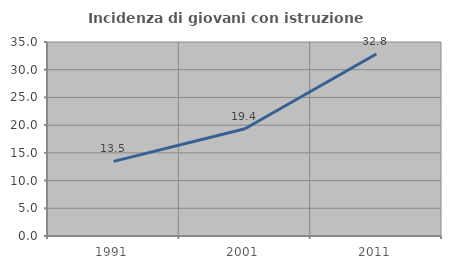
| Category | Incidenza di giovani con istruzione universitaria |
|---|---|
| 1991.0 | 13.468 |
| 2001.0 | 19.36 |
| 2011.0 | 32.835 |